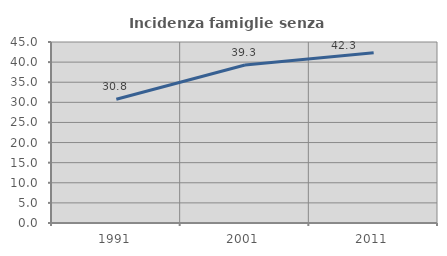
| Category | Incidenza famiglie senza nuclei |
|---|---|
| 1991.0 | 30.769 |
| 2001.0 | 39.286 |
| 2011.0 | 42.321 |